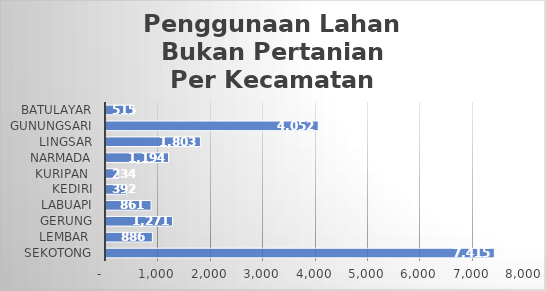
| Category | Series 0 |
|---|---|
| Sekotong | 7415 |
| Lembar  | 886 |
| Gerung | 1271 |
| Labuapi | 861 |
| Kediri | 392 |
| Kuripan  | 234 |
| Narmada | 1194 |
| Lingsar | 1803 |
| Gunungsari | 4052 |
| Batulayar | 515 |